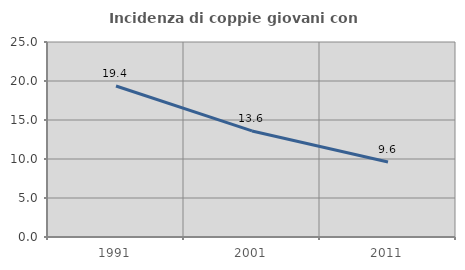
| Category | Incidenza di coppie giovani con figli |
|---|---|
| 1991.0 | 19.361 |
| 2001.0 | 13.599 |
| 2011.0 | 9.618 |